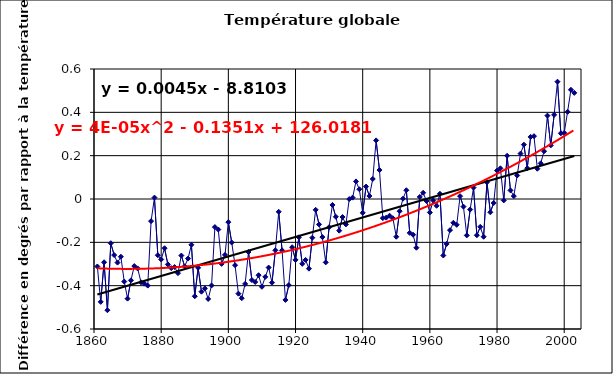
| Category | Series 0 |
|---|---|
| 1861.0 | -0.311 |
| 1862.0 | -0.475 |
| 1863.0 | -0.292 |
| 1864.0 | -0.513 |
| 1865.0 | -0.204 |
| 1866.0 | -0.259 |
| 1867.0 | -0.294 |
| 1868.0 | -0.266 |
| 1869.0 | -0.381 |
| 1870.0 | -0.46 |
| 1871.0 | -0.375 |
| 1872.0 | -0.31 |
| 1873.0 | -0.32 |
| 1874.0 | -0.384 |
| 1875.0 | -0.391 |
| 1876.0 | -0.4 |
| 1877.0 | -0.102 |
| 1878.0 | 0.006 |
| 1879.0 | -0.26 |
| 1880.0 | -0.279 |
| 1881.0 | -0.227 |
| 1882.0 | -0.302 |
| 1883.0 | -0.319 |
| 1884.0 | -0.314 |
| 1885.0 | -0.342 |
| 1886.0 | -0.261 |
| 1887.0 | -0.311 |
| 1888.0 | -0.275 |
| 1889.0 | -0.212 |
| 1890.0 | -0.449 |
| 1891.0 | -0.318 |
| 1892.0 | -0.428 |
| 1893.0 | -0.413 |
| 1894.0 | -0.461 |
| 1895.0 | -0.399 |
| 1896.0 | -0.13 |
| 1897.0 | -0.141 |
| 1898.0 | -0.299 |
| 1899.0 | -0.258 |
| 1900.0 | -0.107 |
| 1901.0 | -0.201 |
| 1902.0 | -0.306 |
| 1903.0 | -0.437 |
| 1904.0 | -0.458 |
| 1905.0 | -0.392 |
| 1906.0 | -0.245 |
| 1907.0 | -0.374 |
| 1908.0 | -0.383 |
| 1909.0 | -0.352 |
| 1910.0 | -0.405 |
| 1911.0 | -0.36 |
| 1912.0 | -0.316 |
| 1913.0 | -0.386 |
| 1914.0 | -0.237 |
| 1915.0 | -0.059 |
| 1916.0 | -0.237 |
| 1917.0 | -0.466 |
| 1918.0 | -0.397 |
| 1919.0 | -0.223 |
| 1920.0 | -0.281 |
| 1921.0 | -0.177 |
| 1922.0 | -0.299 |
| 1923.0 | -0.281 |
| 1924.0 | -0.322 |
| 1925.0 | -0.179 |
| 1926.0 | -0.05 |
| 1927.0 | -0.117 |
| 1928.0 | -0.176 |
| 1929.0 | -0.292 |
| 1930.0 | -0.13 |
| 1931.0 | -0.028 |
| 1932.0 | -0.082 |
| 1933.0 | -0.146 |
| 1934.0 | -0.083 |
| 1935.0 | -0.117 |
| 1936.0 | 0 |
| 1937.0 | 0.006 |
| 1938.0 | 0.081 |
| 1939.0 | 0.045 |
| 1940.0 | -0.064 |
| 1941.0 | 0.057 |
| 1942.0 | 0.014 |
| 1943.0 | 0.092 |
| 1944.0 | 0.27 |
| 1945.0 | 0.134 |
| 1946.0 | -0.088 |
| 1947.0 | -0.086 |
| 1948.0 | -0.077 |
| 1949.0 | -0.089 |
| 1950.0 | -0.174 |
| 1951.0 | -0.056 |
| 1952.0 | 0.001 |
| 1953.0 | 0.04 |
| 1954.0 | -0.156 |
| 1955.0 | -0.165 |
| 1956.0 | -0.225 |
| 1957.0 | 0.01 |
| 1958.0 | 0.029 |
| 1959.0 | -0.01 |
| 1960.0 | -0.062 |
| 1961.0 | -0.006 |
| 1962.0 | -0.031 |
| 1963.0 | 0.024 |
| 1964.0 | -0.261 |
| 1965.0 | -0.207 |
| 1966.0 | -0.144 |
| 1967.0 | -0.11 |
| 1968.0 | -0.119 |
| 1969.0 | 0.013 |
| 1970.0 | -0.035 |
| 1971.0 | -0.168 |
| 1972.0 | -0.049 |
| 1973.0 | 0.053 |
| 1974.0 | -0.167 |
| 1975.0 | -0.128 |
| 1976.0 | -0.174 |
| 1977.0 | 0.077 |
| 1978.0 | -0.061 |
| 1979.0 | -0.018 |
| 1980.0 | 0.131 |
| 1981.0 | 0.142 |
| 1982.0 | -0.006 |
| 1983.0 | 0.2 |
| 1984.0 | 0.04 |
| 1985.0 | 0.013 |
| 1986.0 | 0.108 |
| 1987.0 | 0.21 |
| 1988.0 | 0.251 |
| 1989.0 | 0.142 |
| 1990.0 | 0.287 |
| 1991.0 | 0.29 |
| 1992.0 | 0.14 |
| 1993.0 | 0.165 |
| 1994.0 | 0.22 |
| 1995.0 | 0.385 |
| 1996.0 | 0.247 |
| 1997.0 | 0.388 |
| 1998.0 | 0.541 |
| 1999.0 | 0.303 |
| 2000.0 | 0.305 |
| 2001.0 | 0.402 |
| 2002.0 | 0.504 |
| 2003.0 | 0.49 |